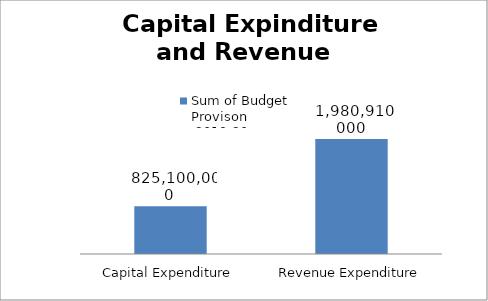
| Category | Sum of Budget 
Provison   
 2019-20 |
|---|---|
| Capital Expenditure | 825100000 |
| Revenue Expenditure | 1980910000 |